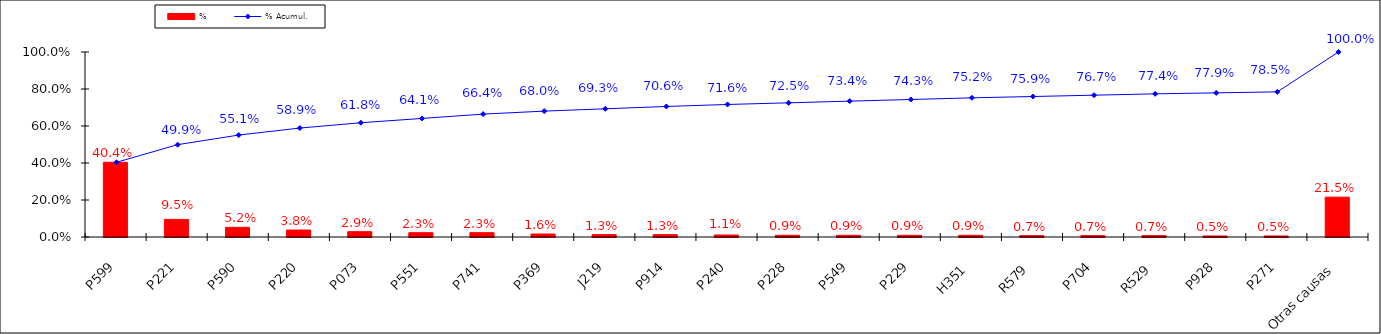
| Category | % |
|---|---|
| P599 | 0.404 |
| P221 | 0.095 |
| P590 | 0.052 |
| P220 | 0.038 |
| P073 | 0.029 |
| P551 | 0.023 |
| P741 | 0.023 |
| P369 | 0.016 |
| J219 | 0.013 |
| P914 | 0.013 |
| P240 | 0.011 |
| P228 | 0.009 |
| P549 | 0.009 |
| P229 | 0.009 |
| H351 | 0.009 |
| R579 | 0.007 |
| P704 | 0.007 |
| R529 | 0.007 |
| P928 | 0.005 |
| P271 | 0.005 |
| Otras causas | 0.215 |